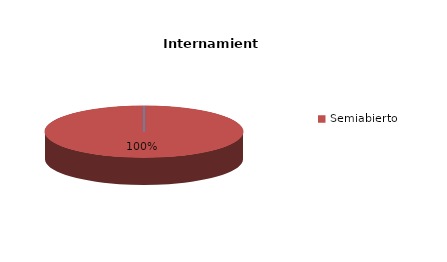
| Category | Series 0 |
|---|---|
| Cerrado | 0 |
| Semiabierto | 2 |
| Abierto | 0 |
| Terapeúticos | 0 |